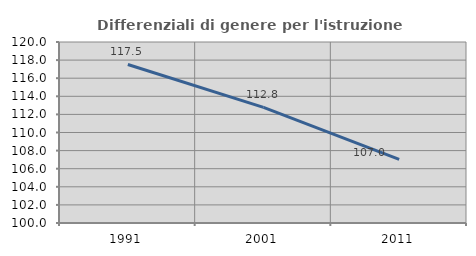
| Category | Differenziali di genere per l'istruzione superiore |
|---|---|
| 1991.0 | 117.516 |
| 2001.0 | 112.779 |
| 2011.0 | 107.026 |